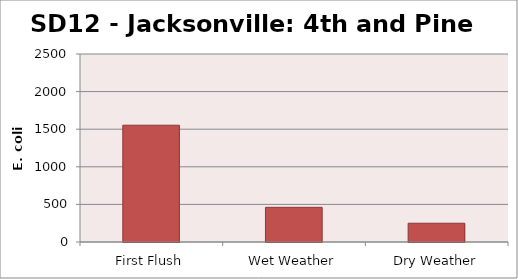
| Category | E. coli MPN |
|---|---|
| First Flush | 1553.1 |
| Wet Weather | 461.1 |
| Dry Weather | 249.5 |